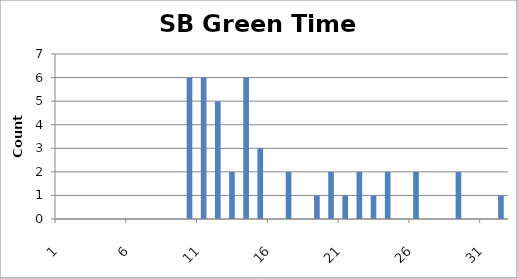
| Category | Series 0 |
|---|---|
| 0 | 0 |
| 1 | 0 |
| 2 | 0 |
| 3 | 0 |
| 4 | 0 |
| 5 | 0 |
| 6 | 0 |
| 7 | 0 |
| 8 | 0 |
| 9 | 6 |
| 10 | 6 |
| 11 | 5 |
| 12 | 2 |
| 13 | 6 |
| 14 | 3 |
| 15 | 0 |
| 16 | 2 |
| 17 | 0 |
| 18 | 1 |
| 19 | 2 |
| 20 | 1 |
| 21 | 2 |
| 22 | 1 |
| 23 | 2 |
| 24 | 0 |
| 25 | 2 |
| 26 | 0 |
| 27 | 0 |
| 28 | 2 |
| 29 | 0 |
| 30 | 0 |
| 31 | 1 |